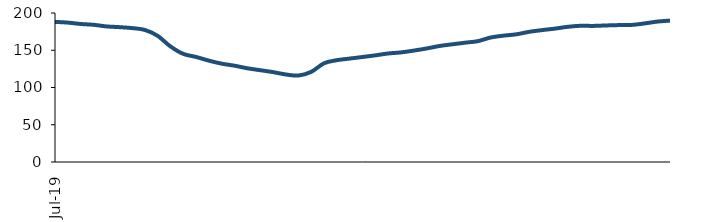
| Category | Series 0 |
|---|---|
| 2019-07-01 | 188.084 |
| 2019-08-01 | 187.109 |
| 2019-09-01 | 185.248 |
| 2019-10-01 | 184.195 |
| 2019-11-01 | 182.028 |
| 2019-12-01 | 181.044 |
| 2020-01-01 | 179.776 |
| 2020-02-01 | 177.328 |
| 2020-03-01 | 169.453 |
| 2020-04-01 | 155.277 |
| 2020-05-01 | 145.207 |
| 2020-06-01 | 141.034 |
| 2020-07-01 | 136.109 |
| 2020-08-01 | 132.034 |
| 2020-09-01 | 129.3 |
| 2020-10-01 | 125.829 |
| 2020-11-01 | 123.263 |
| 2020-12-01 | 120.707 |
| 2021-01-01 | 117.538 |
| 2021-02-01 | 116.084 |
| 2021-03-01 | 121.021 |
| 2021-04-01 | 132.55 |
| 2021-05-01 | 136.669 |
| 2021-06-01 | 138.833 |
| 2021-07-01 | 140.97 |
| 2021-08-01 | 143.159 |
| 2021-09-01 | 145.68 |
| 2021-10-01 | 147.105 |
| 2021-11-01 | 149.536 |
| 2021-12-01 | 152.367 |
| 2022-01-01 | 155.682 |
| 2022-02-01 | 157.996 |
| 2022-03-01 | 160.142 |
| 2022-04-01 | 162.188 |
| 2022-05-01 | 167.088 |
| 2022-06-01 | 169.58 |
| 2022-07-01 | 171.367 |
| 2022-08-01 | 174.694 |
| 2022-09-01 | 177.026 |
| 2022-10-01 | 178.986 |
| 2022-11-01 | 181.425 |
| 2022-12-01 | 182.828 |
| 2023-01-01 | 182.677 |
| 2023-02-01 | 183.284 |
| 2023-03-01 | 183.78 |
| 2023-04-01 | 183.986 |
| 2023-05-01 | 185.967 |
| 2023-06-01 | 188.443 |
| 2023-07-01 | 189.82 |